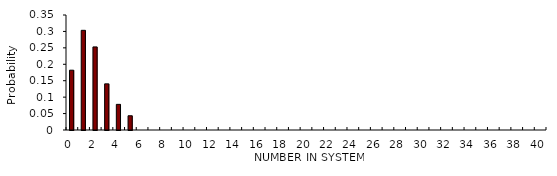
| Category | Series 0 |
|---|---|
| 0.0 | 0.182 |
| 1.0 | 0.303 |
| 2.0 | 0.253 |
| 3.0 | 0.14 |
| 4.0 | 0.078 |
| 5.0 | 0.043 |
| 6.0 | 0 |
| 7.0 | 0 |
| 8.0 | 0 |
| 9.0 | 0 |
| 10.0 | 0 |
| 11.0 | 0 |
| 12.0 | 0 |
| 13.0 | 0 |
| 14.0 | 0 |
| 15.0 | 0 |
| 16.0 | 0 |
| 17.0 | 0 |
| 18.0 | 0 |
| 19.0 | 0 |
| 20.0 | 0 |
| 21.0 | 0 |
| 22.0 | 0 |
| 23.0 | 0 |
| 24.0 | 0 |
| 25.0 | 0 |
| 26.0 | 0 |
| 27.0 | 0 |
| 28.0 | 0 |
| 29.0 | 0 |
| 30.0 | 0 |
| 31.0 | 0 |
| 32.0 | 0 |
| 33.0 | 0 |
| 34.0 | 0 |
| 35.0 | 0 |
| 36.0 | 0 |
| 37.0 | 0 |
| 38.0 | 0 |
| 39.0 | 0 |
| 40.0 | 0 |